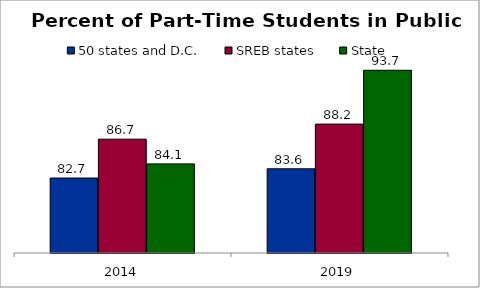
| Category | 50 states and D.C. | SREB states | State |
|---|---|---|---|
| 2014.0 | 82.688 | 86.675 | 84.141 |
| 2019.0 | 83.637 | 88.218 | 93.741 |